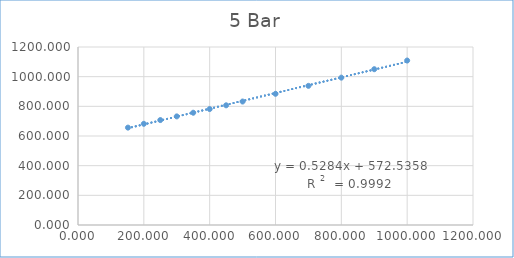
| Category | Series 0 |
|---|---|
| 151.8 | 656.498 |
| 200.0 | 682.226 |
| 250.0 | 707.358 |
| 300.0 | 732.107 |
| 350.0 | 756.832 |
| 400.0 | 781.725 |
| 450.0 | 806.904 |
| 500.0 | 832.418 |
| 600.0 | 884.496 |
| 700.0 | 938.127 |
| 800.0 | 993.407 |
| 900.0 | 1050.311 |
| 1000.0 | 1108.791 |